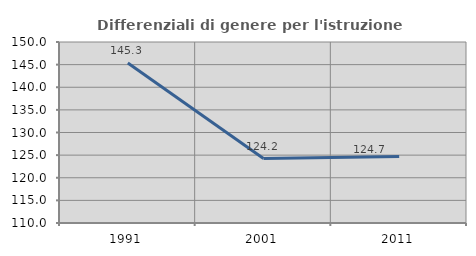
| Category | Differenziali di genere per l'istruzione superiore |
|---|---|
| 1991.0 | 145.343 |
| 2001.0 | 124.247 |
| 2011.0 | 124.717 |